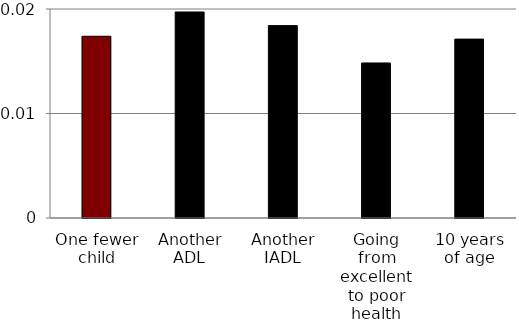
| Category | Series 0 |
|---|---|
| One fewer child | 0.017 |
| Another ADL | 0.02 |
| Another IADL | 0.018 |
| Going from excellent to poor health | 0.015 |
| 10 years of age | 0.017 |